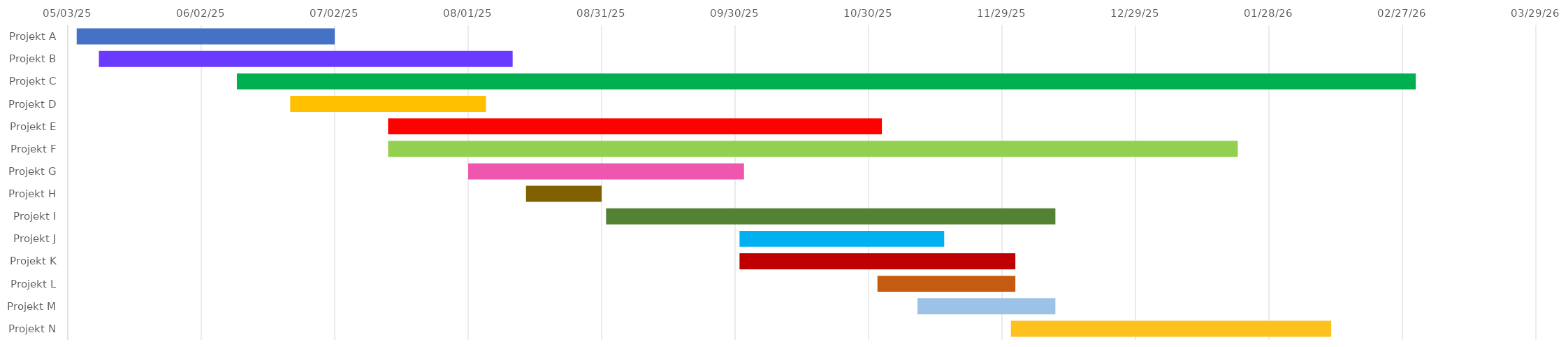
| Category | STARTDATUM | Dauer |
|---|---|---|
| Projekt A | 2025-05-05 | 58 |
| Projekt B | 2025-05-10 | 93 |
| Projekt C | 2025-06-10 | 265 |
| Projekt D | 2025-06-22 | 44 |
| Projekt E | 2025-07-14 | 111 |
| Projekt F | 2025-07-14 | 191 |
| Projekt G | 2025-08-01 | 62 |
| Projekt H | 2025-08-14 | 17 |
| Projekt I | 2025-09-01 | 101 |
| Projekt J | 2025-10-01 | 46 |
| Projekt K | 2025-10-01 | 62 |
| Projekt L | 2025-11-01 | 31 |
| Projekt M | 2025-11-10 | 31 |
| Projekt N | 2025-12-01 | 72 |